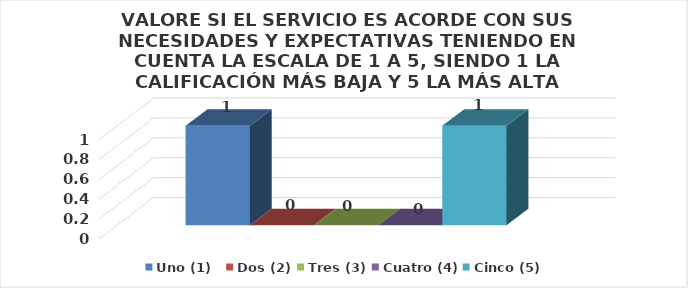
| Category | Uno (1)   | Dos (2) | Tres (3) | Cuatro (4) | Cinco (5) |
|---|---|---|---|---|---|
| 0 | 1 | 0 | 0 | 0 | 1 |